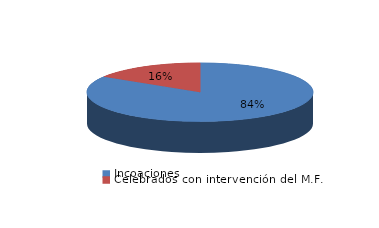
| Category | Series 0 |
|---|---|
| Incoaciones | 9874 |
| Celebrados con intervención del M.F. | 1906 |